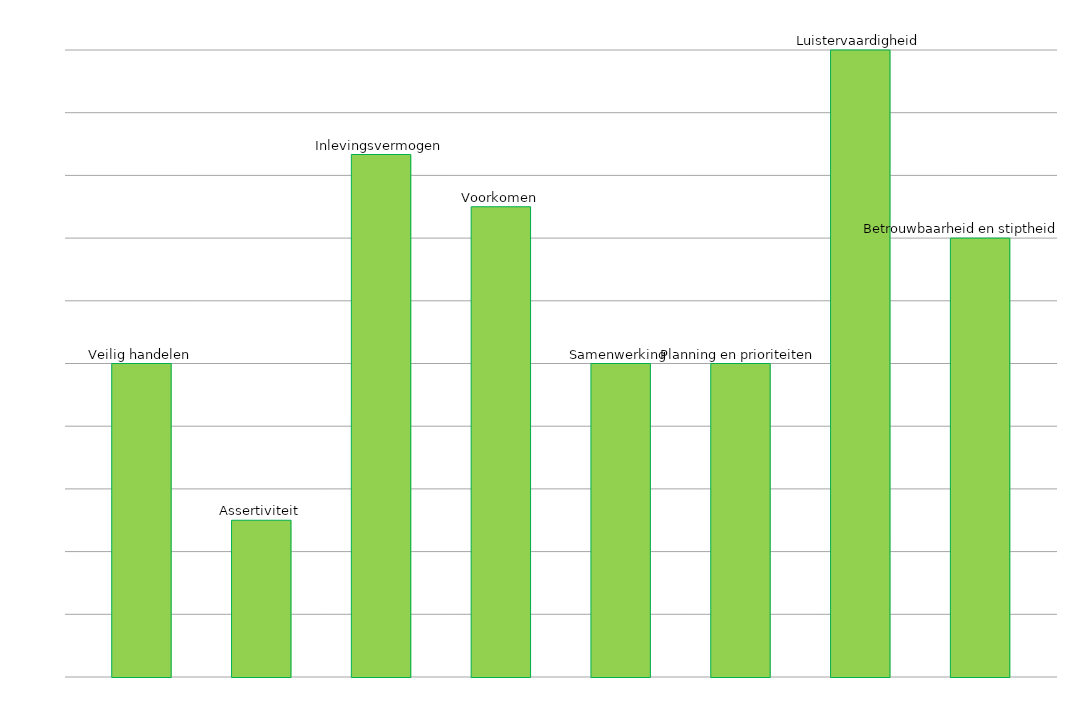
| Category | Veilig handelen | Assertiviteit | Inlevingsvermogen | Voorkomen | Samenwerking | Planning en prioriteiten | Luistervaardigheid | Betrouwbaarheid en stiptheid |
|---|---|---|---|---|---|---|---|---|
| 0 | 2.5 | 1.25 | 4.167 | 3.75 | 2.5 | 2.5 | 5 | 3.5 |